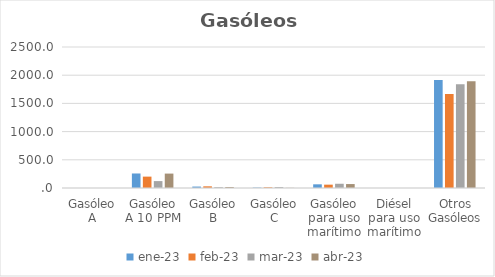
| Category | ene-23 | feb-23 | mar-23 | abr-23 |
|---|---|---|---|---|
| Gasóleo A | 0 | 0 | 0 | 0 |
| Gasóleo A 10 PPM | 257.394 | 201.653 | 122.594 | 255.571 |
| Gasóleo B | 25.396 | 29.622 | 15.27 | 17.908 |
| Gasóleo C | 7.143 | 12.648 | 17.295 | 3.024 |
| Gasóleo para uso marítimo | 65.214 | 59.211 | 75.264 | 69.869 |
| Diésel para uso marítimo | 0 | 0 | 0 | 0 |
| Otros Gasóleos | 1916.93 | 1665.224 | 1841.526 | 1891.507 |